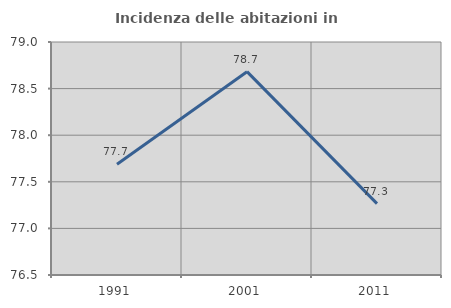
| Category | Incidenza delle abitazioni in proprietà  |
|---|---|
| 1991.0 | 77.688 |
| 2001.0 | 78.682 |
| 2011.0 | 77.266 |